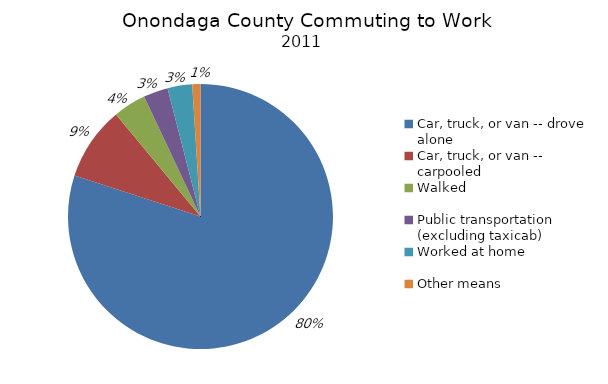
| Category | Onondaga County Commuting to Work Percent of Workers |
|---|---|
| Car, truck, or van -- drove alone | 0.8 |
| Car, truck, or van -- carpooled | 0.09 |
| Walked | 0.04 |
| Public transportation (excluding taxicab) | 0.03 |
| Worked at home | 0.03 |
| Other means | 0.01 |